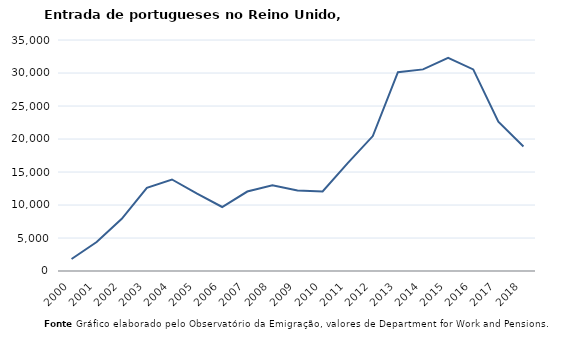
| Category | Entradas |
|---|---|
| 2000.0 | 1811 |
| 2001.0 | 4396 |
| 2002.0 | 7915 |
| 2003.0 | 12603 |
| 2004.0 | 13867 |
| 2005.0 | 11712 |
| 2006.0 | 9696 |
| 2007.0 | 12039 |
| 2008.0 | 12983 |
| 2009.0 | 12211 |
| 2010.0 | 12064 |
| 2011.0 | 16347 |
| 2012.0 | 20443 |
| 2013.0 | 30121 |
| 2014.0 | 30546 |
| 2015.0 | 32301 |
| 2016.0 | 30543 |
| 2017.0 | 22622 |
| 2018.0 | 18871 |